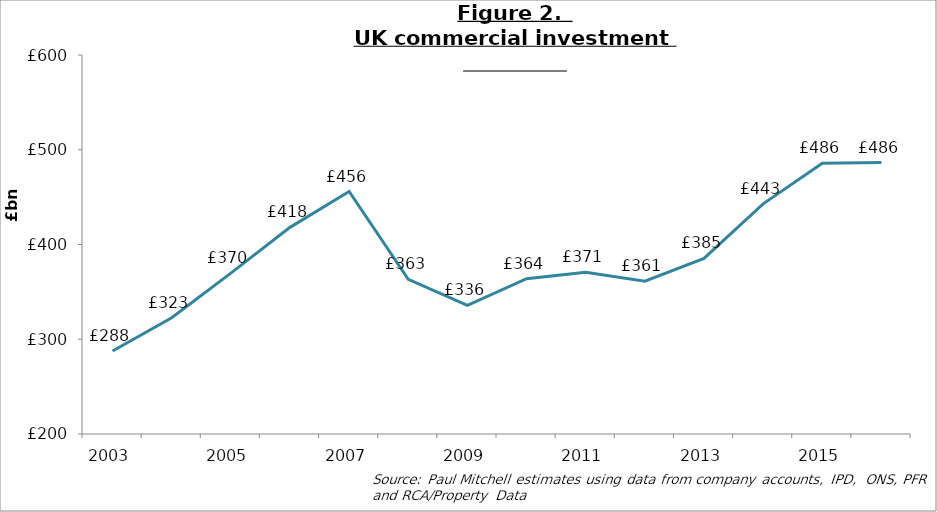
| Category | Series 0 |
|---|---|
| 2003.0 | 287.602 |
| 2004.0 | 322.735 |
| 2005.0 | 369.772 |
| 2006.0 | 418.088 |
| 2007.0 | 455.905 |
| 2008.0 | 363.15 |
| 2009.0 | 335.732 |
| 2010.0 | 363.913 |
| 2011.0 | 370.823 |
| 2012.0 | 361.231 |
| 2013.0 | 385.318 |
| 2014.0 | 442.914 |
| 2015.0 | 485.776 |
| 2016.0 | 486.484 |